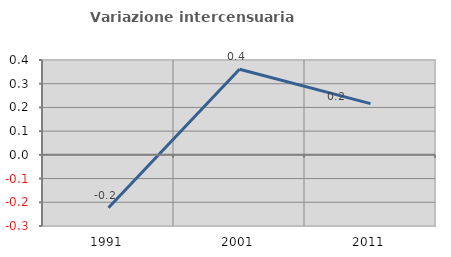
| Category | Variazione intercensuaria annua |
|---|---|
| 1991.0 | -0.223 |
| 2001.0 | 0.361 |
| 2011.0 | 0.216 |